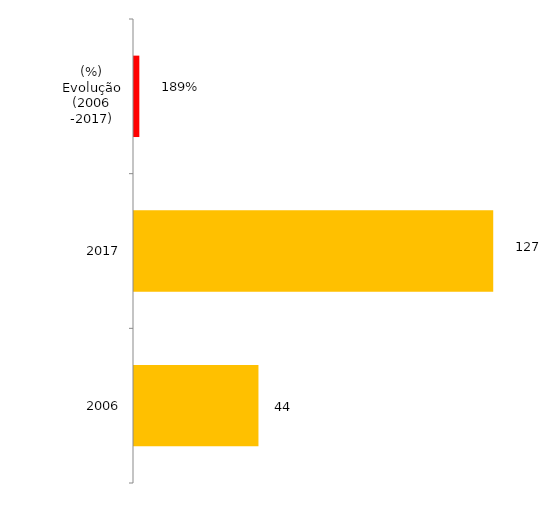
| Category | Estágiarios |
|---|---|
| 2006 | 44 |
| 2017 | 127 |
| (%) Evolução (2006 -2017) | 1.886 |